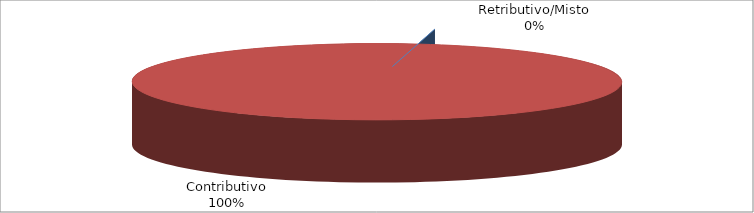
| Category | Series 1 |
|---|---|
| Retributivo/Misto | 0 |
| Contributivo | 29648 |